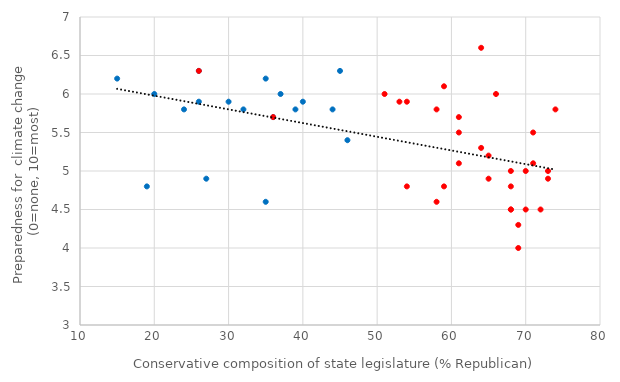
| Category | Preparedness |
|---|---|
| 74.0 | 5.8 |
| 46.0 | 5.4 |
| 53.0 | 5.9 |
| 71.0 | 5.5 |
| 24.0 | 5.8 |
| 35.0 | 6.2 |
| 30.0 | 5.9 |
| 36.0 | 5.7 |
| nan | 5.9 |
| 71.0 | 5.1 |
| 65.0 | 4.9 |
| 19.0 | 4.8 |
| 70.0 | 5 |
| 37.0 | 6 |
| 73.0 | 5 |
| 69.0 | 4.3 |
| 64.0 | 5.3 |
| 68.0 | 4.8 |
| 61.0 | 5.7 |
| 40.0 | 5.9 |
| 26.0 | 6.3 |
| 15.0 | 6.2 |
| 58.0 | 5.8 |
| 44.0 | 5.8 |
| 68.0 | 4.5 |
| 61.0 | 5.5 |
| 59.0 | 4.8 |
| 61.0 | 5.1 |
| 35.0 | 4.6 |
| 51.0 | 6 |
| 27.0 | 4.9 |
| 36.0 | 5.7 |
| 26.0 | 5.9 |
| 66.0 | 6 |
| 65.0 | 5.2 |
| 68.0 | 5 |
| 68.0 | 4.5 |
| 32.0 | 5.8 |
| 54.0 | 5.9 |
| 20.0 | 6 |
| 54.0 | 4.8 |
| 72.0 | 4.5 |
| 73.0 | 4.9 |
| 58.0 | 4.6 |
| 64.0 | 6.6 |
| 26.0 | 6.3 |
| 45.0 | 6.3 |
| 39.0 | 5.8 |
| 69.0 | 4 |
| 59.0 | 6.1 |
| 70.0 | 4.5 |